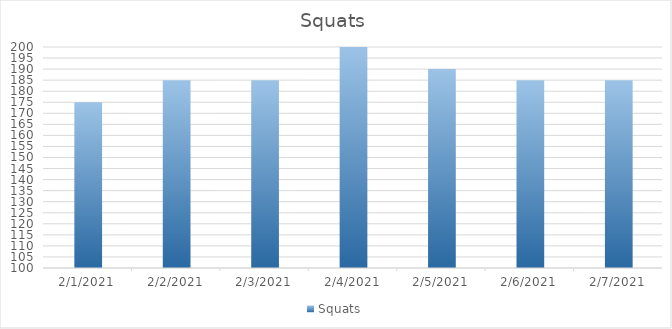
| Category | Squats |
|---|---|
| 2/1/21 | 175 |
| 2/2/21 | 185 |
| 2/3/21 | 185 |
| 2/4/21 | 200 |
| 2/5/21 | 190 |
| 2/6/21 | 185 |
| 2/7/21 | 185 |